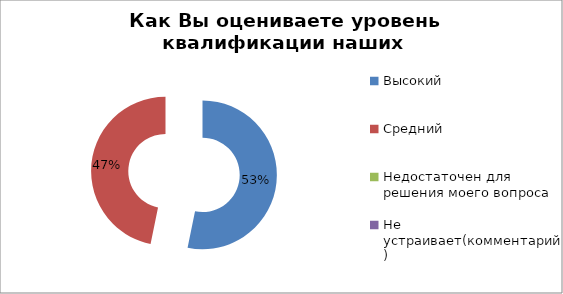
| Category | Как Вы оцениваете уровень квалификации наших специалистов? |
|---|---|
| Высокий | 91 |
| Средний | 80 |
| Недостаточен для решения моего вопроса | 0 |
| Не устраивает(комментарий) | 0 |